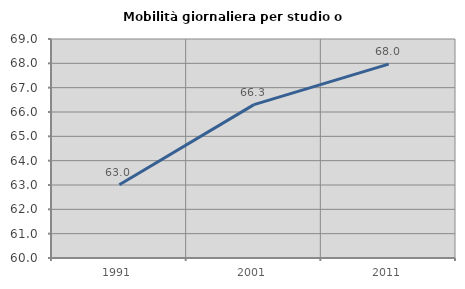
| Category | Mobilità giornaliera per studio o lavoro |
|---|---|
| 1991.0 | 63.012 |
| 2001.0 | 66.301 |
| 2011.0 | 67.968 |